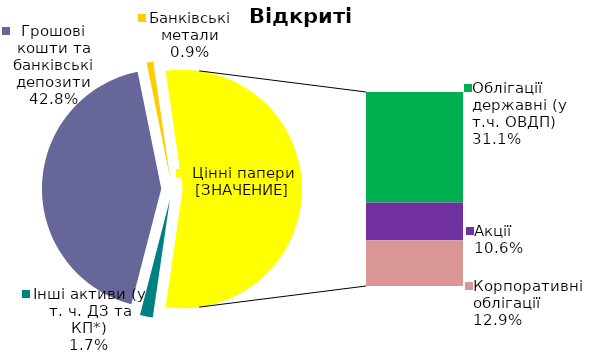
| Category | Series 0 |
|---|---|
| Інші активи (у т. ч. ДЗ та КП*) | 0.017 |
| Грошові кошти та банківські депозити | 0.428 |
| Банківські метали | 0.009 |
| Облігації державні (у т.ч. ОВДП) | 0.311 |
| Облігації місцевих позик | 0 |
| Акцiї | 0.106 |
| Корпоративні облігації | 0.129 |